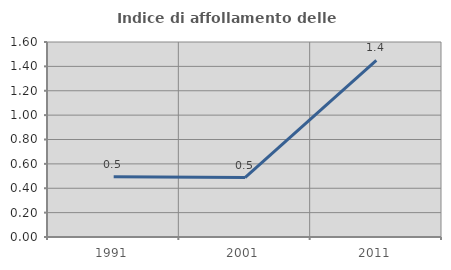
| Category | Indice di affollamento delle abitazioni  |
|---|---|
| 1991.0 | 0.494 |
| 2001.0 | 0.488 |
| 2011.0 | 1.449 |